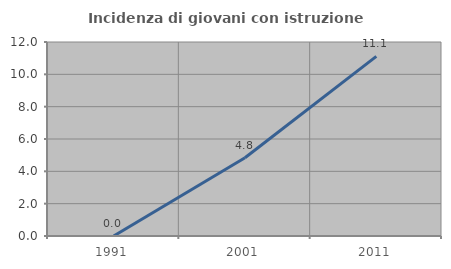
| Category | Incidenza di giovani con istruzione universitaria |
|---|---|
| 1991.0 | 0 |
| 2001.0 | 4.839 |
| 2011.0 | 11.111 |